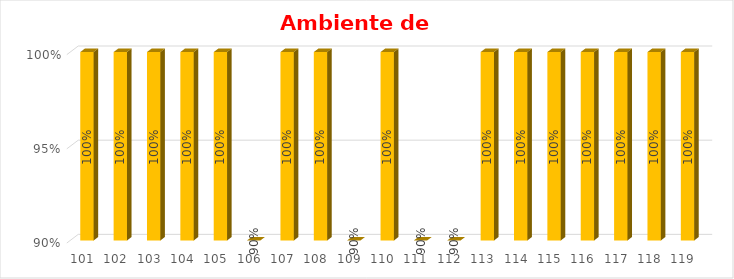
| Category | % Avance |
|---|---|
| 101.0 | 1 |
| 102.0 | 1 |
| 103.0 | 1 |
| 104.0 | 1 |
| 105.0 | 1 |
| 106.0 | 0.9 |
| 107.0 | 1 |
| 108.0 | 1 |
| 109.0 | 0.9 |
| 110.0 | 1 |
| 111.0 | 0.9 |
| 112.0 | 0.9 |
| 113.0 | 1 |
| 114.0 | 1 |
| 115.0 | 1 |
| 116.0 | 1 |
| 117.0 | 1 |
| 118.0 | 1 |
| 119.0 | 1 |